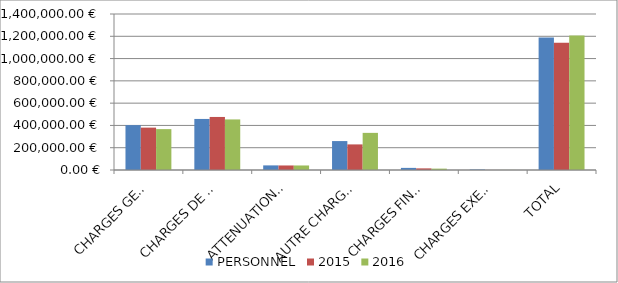
| Category | PERSONNEL | 2015 | 2016 |
|---|---|---|---|
| CHARGES GENERAL | 402628 | 380336 | 366879 |
| CHARGES DE PERSONNEL | 458190 | 476040 | 453795 |
| ATTENUATIONS DE PRODUITS | 41379 | 40682 | 40682 |
| AUTRE CHARGES COURANTEs | 259637 | 229712 | 333222 |
| CHARGES FINANCIERES | 18955 | 14580 | 12272 |
| CHARGES EXEPTIONNELLES | 4266 | 420 | 467 |
| TOTAL | 1188055 | 1141770 | 1207317 |